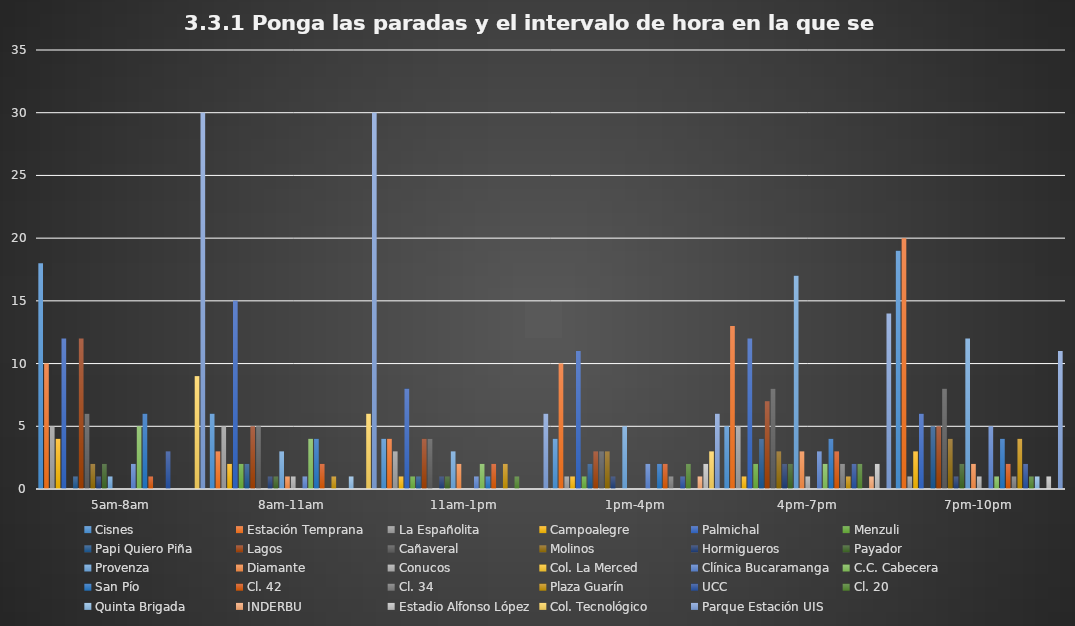
| Category | Cisnes | Estación Temprana | La Españolita | Campoalegre | Palmichal | Menzuli | Papi Quiero Piña | Lagos | Cañaveral | Molinos | Hormigueros | Payador | Provenza | Diamante | Conucos | Col. La Merced | Clínica Bucaramanga | C.C. Cabecera | San Pío | Cl. 42 | Cl. 34 | Plaza Guarín | UCC | Cl. 20 | Quinta Brigada | INDERBU | Estadio Alfonso López | Col. Tecnológico | Parque Estación UIS |
|---|---|---|---|---|---|---|---|---|---|---|---|---|---|---|---|---|---|---|---|---|---|---|---|---|---|---|---|---|---|
| 5am-8am | 18 | 10 | 5 | 4 | 12 | 0 | 1 | 12 | 6 | 2 | 1 | 2 | 1 | 0 | 0 | 0 | 2 | 5 | 6 | 1 | 0 | 0 | 3 | 0 | 0 | 0 | 0 | 9 | 30 |
| 8am-11am | 6 | 3 | 5 | 2 | 15 | 2 | 2 | 5 | 5 | 0 | 1 | 1 | 3 | 1 | 1 | 0 | 1 | 4 | 4 | 2 | 0 | 1 | 0 | 0 | 1 | 0 | 0 | 6 | 30 |
| 11am-1pm | 4 | 4 | 3 | 1 | 8 | 1 | 1 | 4 | 4 | 0 | 1 | 1 | 3 | 2 | 0 | 0 | 1 | 2 | 1 | 2 | 0 | 2 | 0 | 1 | 0 | 0 | 0 | 0 | 6 |
| 1pm-4pm | 4 | 10 | 1 | 1 | 11 | 1 | 2 | 3 | 3 | 3 | 1 | 0 | 5 | 0 | 0 | 0 | 2 | 0 | 2 | 2 | 1 | 0 | 1 | 2 | 0 | 1 | 2 | 3 | 6 |
| 4pm-7pm | 5 | 13 | 5 | 1 | 12 | 2 | 4 | 7 | 8 | 3 | 2 | 2 | 17 | 3 | 1 | 0 | 3 | 2 | 4 | 3 | 2 | 1 | 2 | 2 | 0 | 1 | 2 | 0 | 14 |
| 7pm-10pm | 19 | 20 | 1 | 3 | 6 | 0 | 5 | 5 | 8 | 4 | 1 | 2 | 12 | 2 | 1 | 0 | 5 | 1 | 4 | 2 | 1 | 4 | 2 | 1 | 1 | 0 | 1 | 0 | 11 |